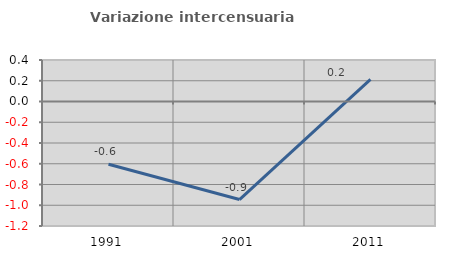
| Category | Variazione intercensuaria annua |
|---|---|
| 1991.0 | -0.605 |
| 2001.0 | -0.945 |
| 2011.0 | 0.214 |